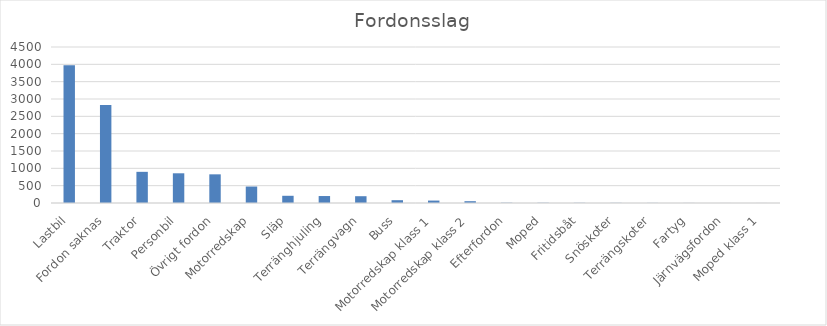
| Category | Summa |
|---|---|
| Lastbil | 3976 |
| Fordon saknas | 2825 |
| Traktor | 899 |
| Personbil | 857 |
| Övrigt fordon | 827 |
| Motorredskap | 475 |
| Släp | 208 |
| Terränghjuling | 201 |
| Terrängvagn | 196 |
| Buss | 81 |
| Motorredskap klass 1 | 70 |
| Motorredskap klass 2 | 52 |
| Efterfordon | 7 |
| Moped | 6 |
| Fritidsbåt | 5 |
| Snöskoter | 4 |
| Terrängskoter | 3 |
| Fartyg | 2 |
| Järnvägsfordon | 1 |
| Moped klass 1 | 1 |